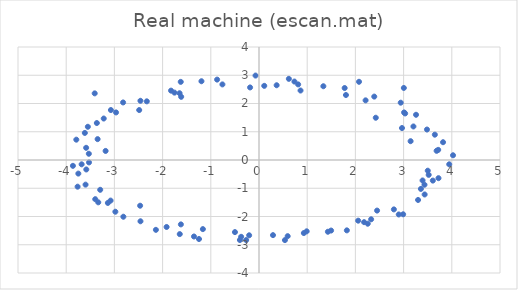
| Category | X (90 deg phase) |
|---|---|
| -2.4853 | 1.768 |
| -0.20432 | -2.665 |
| 2.9404 | 2.029 |
| -3.5304 | 0.221 |
| 2.0575 | -2.148 |
| 0.8125 | 2.676 |
| -3.3973 | -1.387 |
| 3.3935 | -0.725 |
| -1.6236 | 2.766 |
| -1.644 | -2.623 |
| 3.6482 | 0.896 |
| -3.2214 | 1.468 |
| 0.59491 | -2.696 |
| 2.3914 | 2.245 |
| -3.5829 | -0.335 |
| 2.4497 | -1.791 |
| -3.2945 | -1.055 |
| 3.4334 | -0.876 |
| -1.7532 | 2.385 |
| -1.1645 | -2.446 |
| 3.1454 | 0.666 |
| -3.3644 | 1.309 |
| 0.98905 | -2.524 |
| 3.0049 | 2.55 |
| -3.5266 | -0.086 |
| 2.7984 | -1.748 |
| -0.185 | 2.568 |
| -2.4663 | -1.618 |
| 3.5205 | -0.526 |
| -2.3278 | 2.077 |
| -0.49889 | -2.552 |
| 2.9664 | 1.131 |
| 0.36607 | 2.646 |
| -2.9801 | -1.831 |
| 3.5013 | -0.379 |
| -1.6477 | 2.364 |
| -1.2451 | -2.797 |
| 3.204 | 1.187 |
| -3.5509 | 1.176 |
| 0.93037 | -2.586 |
| 2.2116 | 2.112 |
| -3.6796 | -0.153 |
| 2.3265 | -2.099 |
| 0.61941 | 2.873 |
| -3.079 | -1.437 |
| 3.3588 | -1.023 |
| -1.1938 | 2.788 |
| -1.917 | -2.371 |
| 3.7178 | 0.359 |
| -2.8194 | 2.037 |
| -0.26637 | -2.834 |
| 3.032 | 1.648 |
| -3.3482 | 0.739 |
| 1.8227 | -2.49 |
| 1.3353 | 2.611 |
| -3.5985 | -0.872 |
| 3.4368 | -1.22 |
| -0.759 | 2.676 |
| -2.459 | -2.169 |
| 4.0255 | 0.167 |
| -3.4087 | 2.359 |
| -0.37042 | -2.719 |
| 3.2582 | 1.601 |
| -3.7901 | 0.72 |
| 1.4956 | -2.497 |
| 1.8038 | 2.3 |
| -3.7482 | -0.481 |
| 2.9907 | -1.922 |
| 0.10904 | 2.625 |
| -3.1355 | -1.52 |
| 3.6065 | -0.729 |
| -1.6145 | 2.236 |
| -1.6208 | -2.279 |
| 3.6849 | 0.325 |
| -2.966 | 1.684 |
| 0.29031 | -2.659 |
| 2.4228 | 1.496 |
| -3.5864 | 0.431 |
| 2.1805 | -2.2 |
| 0.86181 | 2.459 |
| 3.3001 | -1.415 |
| -0.86906 | 2.846 |
| -2.1391 | -2.472 |
| 3.8185 | 0.63 |
| -3.0728 | 1.769 |
| 0.53795 | -2.836 |
| 2.075 | 2.769 |
| -3.8608 | -0.207 |
| 2.8993 | -1.928 |
| -0.071882 | 2.989 |
| -2.814 | -2.008 |
| 3.9466 | -0.153 |
| -2.4598 | 2.096 |
| -0.3966 | -2.832 |
| 3.0097 | 1.683 |
| -3.1823 | 0.321 |
| 2.2563 | -2.255 |
| 0.73483 | 2.777 |
| -3.3348 | -1.498 |
| 3.7238 | -0.643 |
| -1.825 | 2.455 |
| -1.3488 | -2.708 |
| 3.4851 | 1.079 |
| -3.6134 | 0.958 |
| 1.4293 | -2.54 |
| 1.7771 | 2.548 |
| -3.7633 | -0.945 |